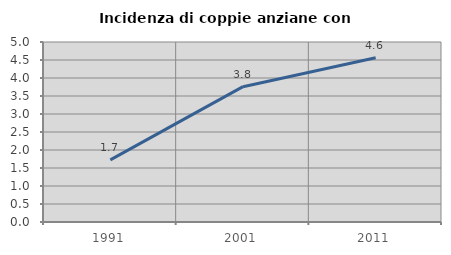
| Category | Incidenza di coppie anziane con figli |
|---|---|
| 1991.0 | 1.727 |
| 2001.0 | 3.759 |
| 2011.0 | 4.561 |